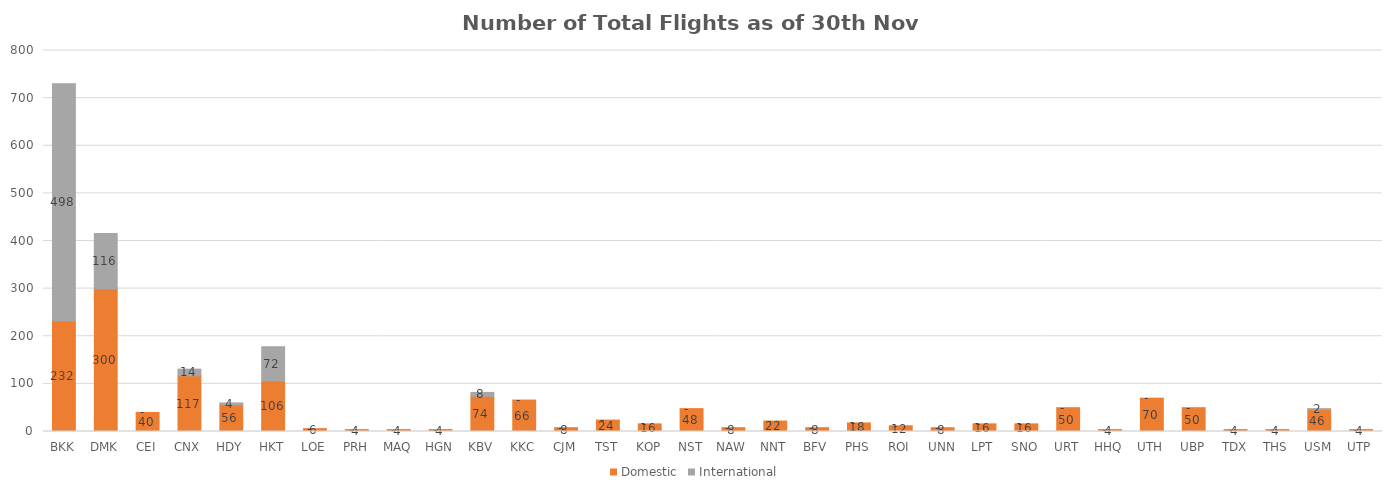
| Category | Domestic | International |
|---|---|---|
| BKK | 232 | 498 |
| DMK | 300 | 116 |
| CEI | 40 | 0 |
| CNX | 117 | 14 |
| HDY | 56 | 4 |
| HKT | 106 | 72 |
| LOE | 6 | 0 |
| PRH | 4 | 0 |
| MAQ | 4 | 0 |
| HGN | 4 | 0 |
| KBV | 74 | 8 |
| KKC | 66 | 0 |
| CJM | 8 | 0 |
| TST | 24 | 0 |
| KOP | 16 | 0 |
| NST | 48 | 0 |
| NAW | 8 | 0 |
| NNT | 22 | 0 |
| BFV | 8 | 0 |
| PHS | 18 | 0 |
| ROI | 12 | 0 |
| UNN | 8 | 0 |
| LPT | 16 | 0 |
| SNO | 16 | 0 |
| URT | 50 | 0 |
| HHQ | 4 | 0 |
| UTH | 70 | 0 |
| UBP | 50 | 0 |
| TDX | 4 | 0 |
| THS | 4 | 0 |
| USM | 46 | 2 |
| UTP | 4 | 0 |